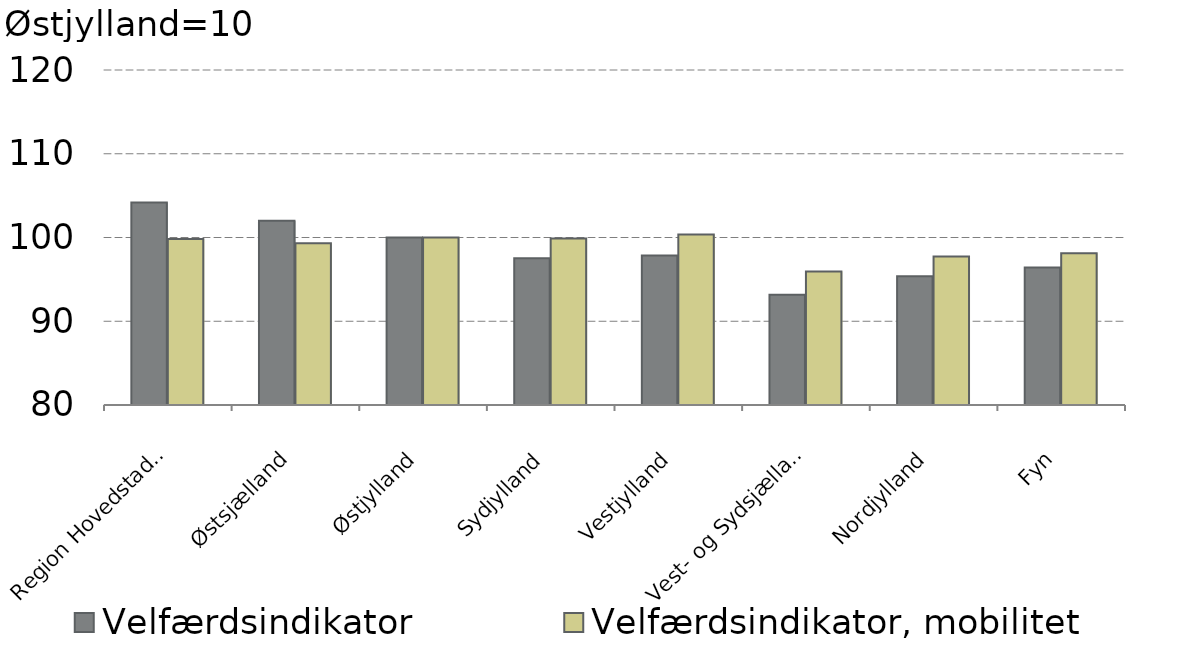
| Category |  Velfærdsindikator |  Velfærdsindikator, mobilitet |
|---|---|---|
| Region Hovedstaden | 104.175 | 99.818 |
| Østsjælland | 101.989 | 99.303 |
| Østjylland | 100 | 100 |
| Sydjylland | 97.535 | 99.879 |
| Vestjylland | 97.848 | 100.357 |
| Vest- og Sydsjælland | 93.163 | 95.929 |
| Nordjylland | 95.381 | 97.74 |
| Fyn | 96.416 | 98.126 |